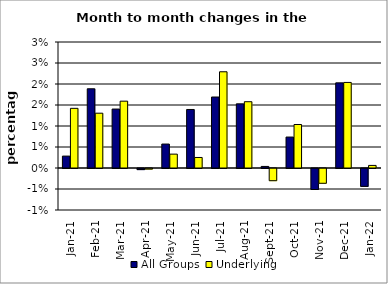
| Category | All Groups | Underlying |
|---|---|---|
| 2021-01-01 | 0.003 | 0.014 |
| 2021-02-01 | 0.019 | 0.013 |
| 2021-03-01 | 0.014 | 0.016 |
| 2021-04-01 | 0 | 0 |
| 2021-05-01 | 0.006 | 0.003 |
| 2021-06-01 | 0.014 | 0.003 |
| 2021-07-01 | 0.017 | 0.023 |
| 2021-08-01 | 0.015 | 0.016 |
| 2021-09-01 | 0 | -0.003 |
| 2021-10-01 | 0.007 | 0.01 |
| 2021-11-01 | -0.005 | -0.004 |
| 2021-12-01 | 0.02 | 0.02 |
| 2022-01-01 | -0.004 | 0.001 |